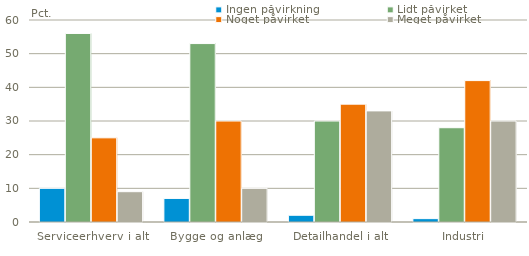
| Category | Ingen påvirkning | Lidt påvirket | Noget påvirket | Meget påvirket |
|---|---|---|---|---|
| Serviceerhverv i alt | 10 | 56 | 25 | 9 |
| Bygge og anlæg | 7 | 53 | 30 | 10 |
| Detailhandel i alt | 2 | 30 | 35 | 33 |
| Industri | 1 | 28 | 42 | 30 |